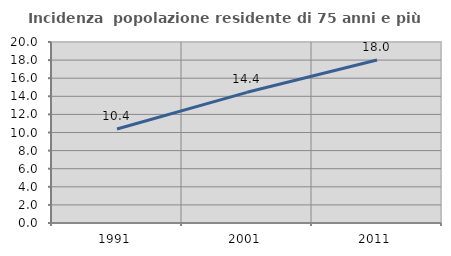
| Category | Incidenza  popolazione residente di 75 anni e più |
|---|---|
| 1991.0 | 10.381 |
| 2001.0 | 14.44 |
| 2011.0 | 18.003 |